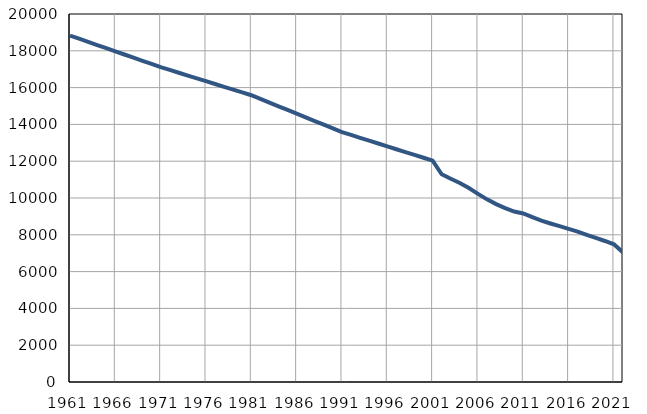
| Category | Број
становника |
|---|---|
| 1961.0 | 18829 |
| 1962.0 | 18657 |
| 1963.0 | 18486 |
| 1964.0 | 18314 |
| 1965.0 | 18143 |
| 1966.0 | 17971 |
| 1967.0 | 17799 |
| 1968.0 | 17628 |
| 1969.0 | 17456 |
| 1970.0 | 17285 |
| 1971.0 | 17113 |
| 1972.0 | 16960 |
| 1973.0 | 16808 |
| 1974.0 | 16655 |
| 1975.0 | 16502 |
| 1976.0 | 16350 |
| 1977.0 | 16197 |
| 1978.0 | 16044 |
| 1979.0 | 15891 |
| 1980.0 | 15739 |
| 1981.0 | 15586 |
| 1982.0 | 15385 |
| 1983.0 | 15185 |
| 1984.0 | 14985 |
| 1985.0 | 14784 |
| 1986.0 | 14584 |
| 1987.0 | 14384 |
| 1988.0 | 14183 |
| 1989.0 | 13984 |
| 1990.0 | 13783 |
| 1991.0 | 13582 |
| 1992.0 | 13427 |
| 1993.0 | 13272 |
| 1994.0 | 13116 |
| 1995.0 | 12961 |
| 1996.0 | 12806 |
| 1997.0 | 12651 |
| 1998.0 | 12497 |
| 1999.0 | 12342 |
| 2000.0 | 12186 |
| 2001.0 | 12031 |
| 2002.0 | 11290 |
| 2003.0 | 11048 |
| 2004.0 | 10813 |
| 2005.0 | 10539 |
| 2006.0 | 10227 |
| 2007.0 | 9927 |
| 2008.0 | 9667 |
| 2009.0 | 9454 |
| 2010.0 | 9263 |
| 2011.0 | 9157 |
| 2012.0 | 8958 |
| 2013.0 | 8767 |
| 2014.0 | 8614 |
| 2015.0 | 8468 |
| 2016.0 | 8323 |
| 2017.0 | 8176 |
| 2018.0 | 7998 |
| 2019.0 | 7829 |
| 2020.0 | 7664 |
| 2021.0 | 7482 |
| 2022.0 | 7041 |